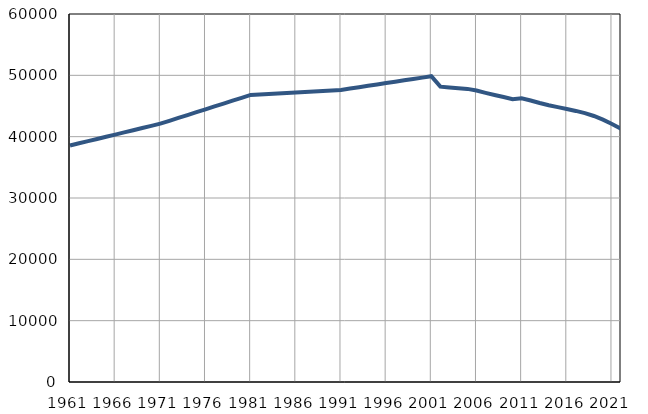
| Category | Population
size |
|---|---|
| 1961.0 | 38562 |
| 1962.0 | 38918 |
| 1963.0 | 39274 |
| 1964.0 | 39630 |
| 1965.0 | 39986 |
| 1966.0 | 40342 |
| 1967.0 | 40698 |
| 1968.0 | 41054 |
| 1969.0 | 41410 |
| 1970.0 | 41766 |
| 1971.0 | 42122 |
| 1972.0 | 42590 |
| 1973.0 | 43058 |
| 1974.0 | 43526 |
| 1975.0 | 43994 |
| 1976.0 | 44462 |
| 1977.0 | 44931 |
| 1978.0 | 45399 |
| 1979.0 | 45867 |
| 1980.0 | 46335 |
| 1981.0 | 46803 |
| 1982.0 | 46885 |
| 1983.0 | 46966 |
| 1984.0 | 47048 |
| 1985.0 | 47129 |
| 1986.0 | 47210 |
| 1987.0 | 47292 |
| 1988.0 | 47374 |
| 1989.0 | 47455 |
| 1990.0 | 47537 |
| 1991.0 | 47618 |
| 1992.0 | 47841 |
| 1993.0 | 48065 |
| 1994.0 | 48288 |
| 1995.0 | 48511 |
| 1996.0 | 48735 |
| 1997.0 | 48958 |
| 1998.0 | 49182 |
| 1999.0 | 49405 |
| 2000.0 | 49628 |
| 2001.0 | 49852 |
| 2002.0 | 48153 |
| 2003.0 | 48019 |
| 2004.0 | 47909 |
| 2005.0 | 47790 |
| 2006.0 | 47522 |
| 2007.0 | 47146 |
| 2008.0 | 46796 |
| 2009.0 | 46473 |
| 2010.0 | 46110 |
| 2011.0 | 46271 |
| 2012.0 | 45904 |
| 2013.0 | 45493 |
| 2014.0 | 45125 |
| 2015.0 | 44823 |
| 2016.0 | 44516 |
| 2017.0 | 44197 |
| 2018.0 | 43834 |
| 2019.0 | 43370 |
| 2020.0 | 42766 |
| 2021.0 | 42078 |
| 2022.0 | 41301 |